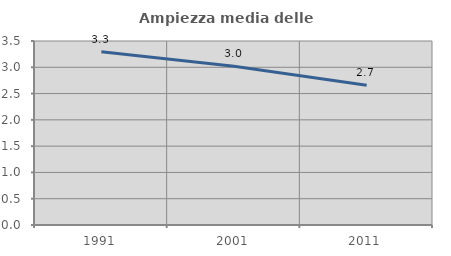
| Category | Ampiezza media delle famiglie |
|---|---|
| 1991.0 | 3.296 |
| 2001.0 | 3.019 |
| 2011.0 | 2.659 |